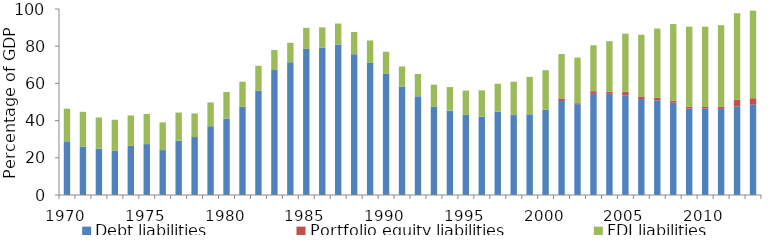
| Category | Debt liabilities | Portfolio equity liabilities | FDI liabilities |
|---|---|---|---|
| 1970.0 | 28.874 | 0 | 17.548 |
| 1971.0 | 26.089 | 0 | 18.638 |
| 1972.0 | 24.867 | 0 | 16.804 |
| 1973.0 | 23.722 | 0 | 16.742 |
| 1974.0 | 26.431 | 0 | 16.35 |
| 1975.0 | 27.36 | 0 | 16.249 |
| 1976.0 | 24.157 | 0 | 14.894 |
| 1977.0 | 29.218 | 0 | 15.1 |
| 1978.0 | 31.16 | 0 | 12.702 |
| 1979.0 | 36.97 | 0 | 12.803 |
| 1980.0 | 41.123 | 0 | 14.269 |
| 1981.0 | 47.402 | 0 | 13.53 |
| 1982.0 | 56.104 | 0 | 13.367 |
| 1983.0 | 67.241 | 0 | 10.693 |
| 1984.0 | 71.334 | 0 | 10.507 |
| 1985.0 | 78.534 | 0 | 11.348 |
| 1986.0 | 79.345 | 0 | 10.791 |
| 1987.0 | 80.945 | 0 | 11.243 |
| 1988.0 | 75.72 | 0 | 11.921 |
| 1989.0 | 71.036 | 0 | 12.047 |
| 1990.0 | 65.1 | 0 | 11.916 |
| 1991.0 | 58.343 | 0 | 10.775 |
| 1992.0 | 53.063 | 0 | 11.998 |
| 1993.0 | 47.601 | 0.002 | 11.718 |
| 1994.0 | 45.343 | 0.012 | 12.695 |
| 1995.0 | 43.047 | 0.029 | 13.073 |
| 1996.0 | 42.102 | 0.035 | 14.13 |
| 1997.0 | 44.749 | 0.09 | 14.972 |
| 1998.0 | 42.931 | 0.088 | 17.902 |
| 1999.0 | 43.325 | 0.077 | 20.116 |
| 2000.0 | 45.809 | 0.096 | 21.222 |
| 2001.0 | 50.554 | 1.36 | 23.842 |
| 2002.0 | 48.838 | 0.51 | 24.539 |
| 2003.0 | 54.364 | 1.443 | 24.693 |
| 2004.0 | 54.409 | 1.102 | 27.175 |
| 2005.0 | 53.63 | 1.963 | 31.148 |
| 2006.0 | 51.577 | 1.421 | 33.129 |
| 2007.0 | 50.879 | 1.482 | 37.122 |
| 2008.0 | 49.599 | 1.059 | 41.248 |
| 2009.0 | 46.411 | 1.019 | 43.072 |
| 2010.0 | 46.567 | 0.831 | 43.066 |
| 2011.0 | 46.311 | 1.197 | 43.779 |
| 2012.0 | 47.48 | 3.79 | 46.473 |
| 2013.0 | 48.511 | 3.517 | 47.073 |